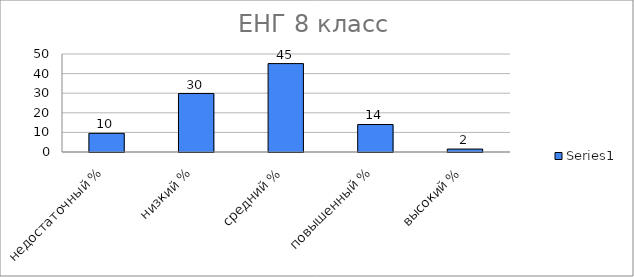
| Category | Series 0 |
|---|---|
| недостаточный % | 9.524 |
| низкий % | 29.825 |
| средний % | 45.113 |
| повышенный % | 14.035 |
| высокий % | 1.504 |